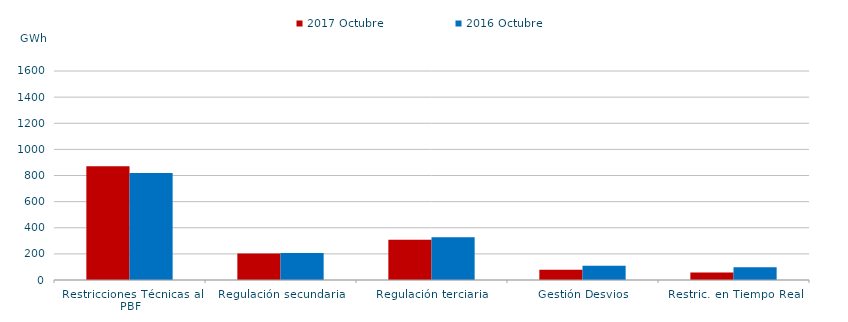
| Category | 2017 | 2016 |
|---|---|---|
| Restricciones Técnicas al PBF | 870.368 | 819.93 |
| Regulación secundaria | 203.218 | 206.102 |
| Regulación terciaria | 307.617 | 326.876 |
| Gestión Desvios | 78.316 | 108.565 |
| Restric. en Tiempo Real | 56.579 | 98.452 |